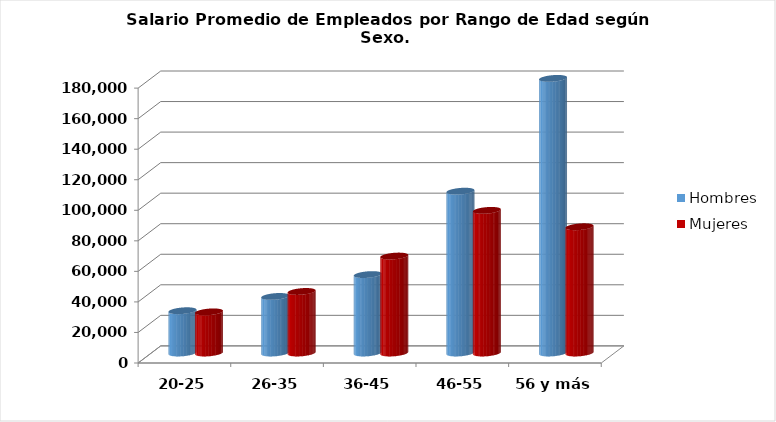
| Category | Hombres | Mujeres |
|---|---|---|
| 20-25 | 27682.667 | 26928.571 |
| 26-35 | 37034.346 | 40295.275 |
| 36-45 | 51360.025 | 63492.132 |
| 46-55 | 105968.871 | 93394.789 |
| 56 y más | 179830.24 | 82659.734 |